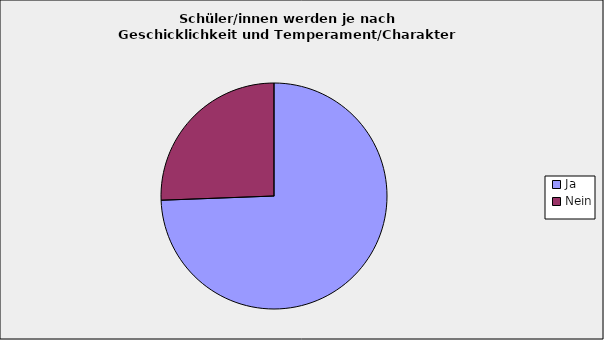
| Category | Series 0 |
|---|---|
| Ja | 0.744 |
| Nein | 0.256 |